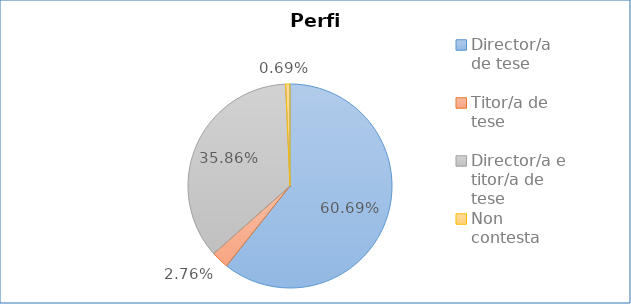
| Category | Perfil |
|---|---|
| Director/a de tese | 0.607 |
| Titor/a de tese | 0.028 |
| Director/a e titor/a de tese | 0.359 |
| Non contesta | 0.007 |